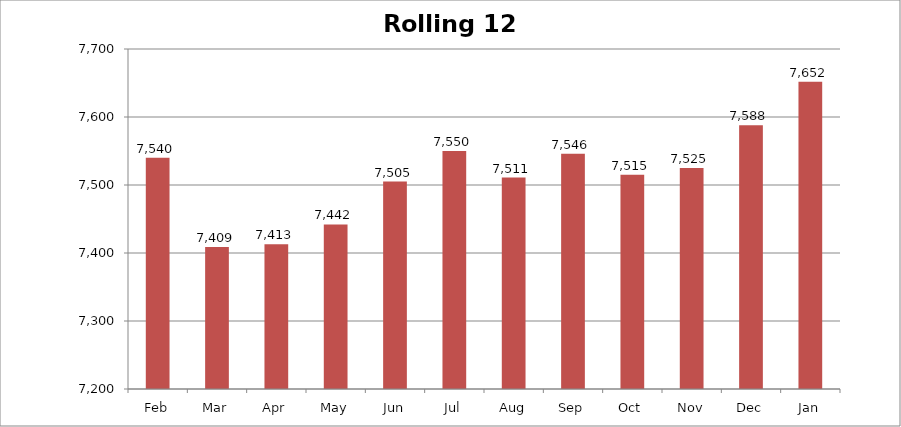
| Category | Rolling 12 Month |
|---|---|
| Feb | 7540 |
| Mar | 7409 |
| Apr | 7413 |
| May | 7442 |
| Jun | 7505 |
| Jul | 7550 |
| Aug | 7511 |
| Sep | 7546 |
| Oct | 7515 |
| Nov | 7525 |
| Dec | 7588 |
| Jan | 7652 |